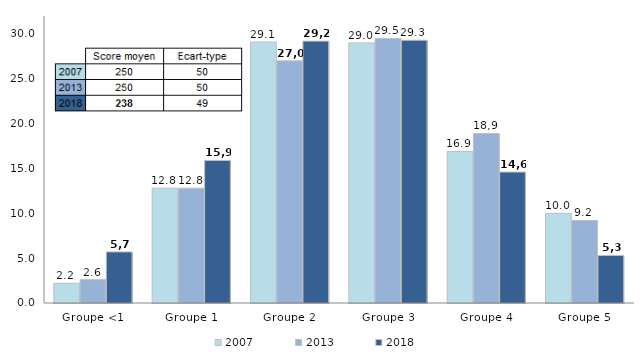
| Category | 2007 | 2013 | 2018 |
|---|---|---|---|
| Groupe <1 | 2.2 | 2.6 | 5.7 |
| Groupe 1 | 12.8 | 12.8 | 15.9 |
| Groupe 2 | 29.1 | 27 | 29.2 |
| Groupe 3 | 29 | 29.5 | 29.3 |
| Groupe 4 | 16.9 | 18.9 | 14.6 |
| Groupe 5 | 10 | 9.2 | 5.3 |